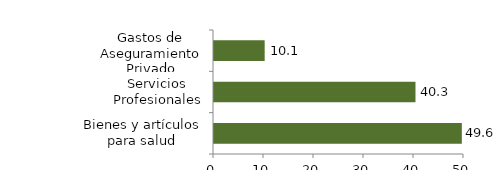
| Category | Salud |
|---|---|
| Bienes y artículos para salud | 49.566 |
| Servicios Profesionales | 40.298 |
| Gastos de Aseguramiento Privado | 10.136 |